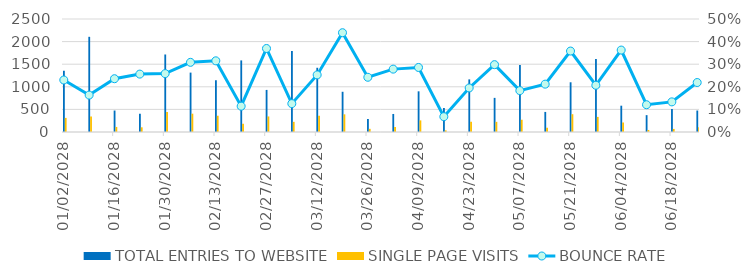
| Category | TOTAL ENTRIES TO WEBSITE | SINGLE PAGE VISITS |
|---|---|---|
| 01/02/2028 | 1356 | 312 |
| 01/09/2028 | 2106 | 344 |
| 01/16/2028 | 475 | 112 |
| 01/23/2028 | 406 | 104 |
| 01/30/2028 | 1715 | 443 |
| 02/06/2028 | 1314 | 405 |
| 02/13/2028 | 1143 | 360 |
| 02/20/2028 | 1584 | 181 |
| 02/27/2028 | 931 | 344 |
| 03/05/2028 | 1793 | 225 |
| 03/12/2028 | 1421 | 359 |
| 03/19/2028 | 890 | 391 |
| 03/26/2028 | 289 | 70 |
| 04/02/2028 | 399 | 111 |
| 04/09/2028 | 900 | 257 |
| 04/16/2028 | 531 | 36 |
| 04/23/2028 | 1164 | 227 |
| 04/30/2028 | 755 | 225 |
| 05/07/2028 | 1480 | 271 |
| 05/14/2028 | 444 | 94 |
| 05/21/2028 | 1100 | 394 |
| 05/28/2028 | 1615 | 334 |
| 06/04/2028 | 582 | 211 |
| 06/11/2028 | 373 | 45 |
| 06/18/2028 | 510 | 68 |
| 06/25/2028 | 475 | 104 |